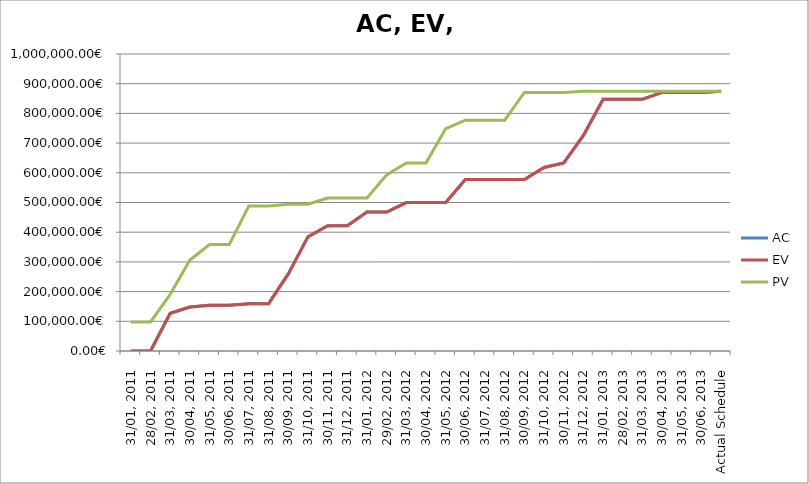
| Category | AC | EV | PV |
|---|---|---|---|
| 31/01, 2011 | 0 | 0 | 98025.947 |
| 28/02, 2011 | 0 | 0 | 98025.947 |
| 31/03, 2011 | 126782.595 | 126782.595 | 190725.937 |
| 30/04, 2011 | 148097.042 | 148097.042 | 306548.492 |
| 31/05, 2011 | 153767.829 | 153767.829 | 358246.181 |
| 30/06, 2011 | 153767.829 | 153767.829 | 358246.181 |
| 31/07, 2011 | 159438.616 | 159438.616 | 488485.694 |
| 31/08, 2011 | 159438.616 | 159438.616 | 488485.694 |
| 30/09, 2011 | 259617.512 | 259617.512 | 494156.48 |
| 31/10, 2011 | 384186.238 | 384186.238 | 494156.48 |
| 30/11, 2011 | 421828.695 | 421828.695 | 515169.567 |
| 31/12, 2011 | 421828.695 | 421828.695 | 515169.567 |
| 31/01, 2012 | 467855.597 | 467855.597 | 515169.567 |
| 29/02, 2012 | 467855.597 | 467855.597 | 592988.387 |
| 31/03, 2012 | 499827.267 | 499827.267 | 633262.997 |
| 30/04, 2012 | 499827.267 | 499827.267 | 633262.997 |
| 31/05, 2012 | 499827.267 | 499827.267 | 748908.049 |
| 30/06, 2012 | 577646.087 | 577646.087 | 777100.276 |
| 31/07, 2012 | 577646.087 | 577646.087 | 777100.276 |
| 31/08, 2012 | 577646.087 | 577646.087 | 777100.276 |
| 30/09, 2012 | 577646.087 | 577646.087 | 870526.823 |
| 31/10, 2012 | 617920.697 | 617920.697 | 870526.823 |
| 30/11, 2012 | 633262.997 | 633262.997 | 870526.823 |
| 31/12, 2012 | 725894.598 | 725894.598 | 874554.284 |
| 31/01, 2013 | 847513.372 | 847513.372 | 874554.284 |
| 28/02, 2013 | 847513.372 | 847513.372 | 874554.284 |
| 31/03, 2013 | 847513.372 | 847513.372 | 874554.284 |
| 30/04, 2013 | 870526.823 | 870526.823 | 874554.284 |
| 31/05, 2013 | 870526.823 | 870526.823 | 874554.284 |
| 30/06, 2013 | 870526.823 | 870526.823 | 874554.284 |
| Actual Schedule | 874554.284 | 874554.284 | 874554.284 |